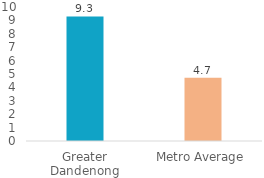
| Category | Series 0 |
|---|---|
| Greater Dandenong | 9.299 |
| Metro Average | 4.719 |